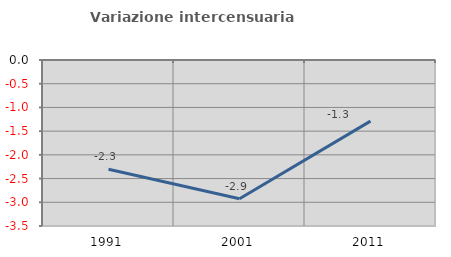
| Category | Variazione intercensuaria annua |
|---|---|
| 1991.0 | -2.302 |
| 2001.0 | -2.924 |
| 2011.0 | -1.289 |